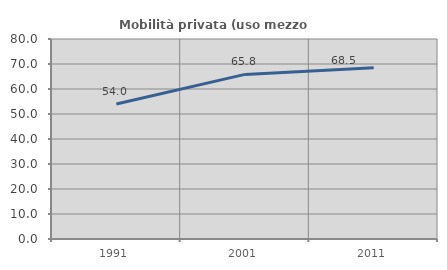
| Category | Mobilità privata (uso mezzo privato) |
|---|---|
| 1991.0 | 54.021 |
| 2001.0 | 65.845 |
| 2011.0 | 68.539 |